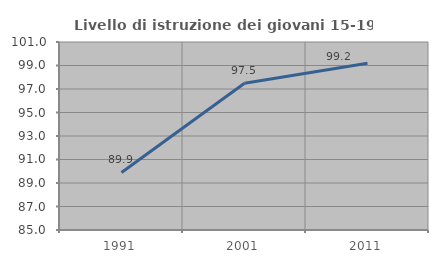
| Category | Livello di istruzione dei giovani 15-19 anni |
|---|---|
| 1991.0 | 89.896 |
| 2001.0 | 97.492 |
| 2011.0 | 99.191 |